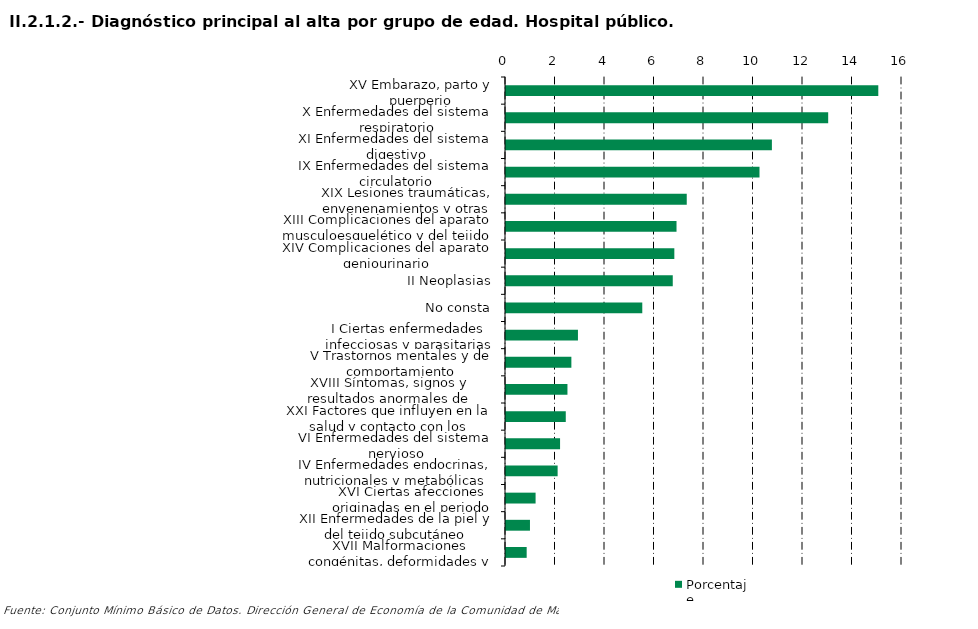
| Category | Porcentaje |
|---|---|
| XV Embarazo, parto y puerperio | 15.042 |
| X Enfermedades del sistema respiratorio | 13.018 |
| XI Enfermedades del sistema digestivo | 10.743 |
| IX Enfermedades del sistema circulatorio | 10.242 |
| XIX Lesiones traumáticas, envenenamientos y otras consecuencias de causas externas | 7.303 |
| XIII Complicaciones del aparato musculoesquelético y del tejido conectivo | 6.89 |
| XIV Complicaciones del aparato geniourinario | 6.801 |
| II Neoplasias | 6.738 |
| No consta | 5.506 |
| I Ciertas enfermedades infecciosas y parasitarias | 2.907 |
| V Trastornos mentales y de comportamiento | 2.641 |
| XVIII Síntomas, signos y resultados anormales de pruebas complementarias, no clasificados bajo otro concepto | 2.483 |
| XXI Factores que influyen en la salud y contacto con los servicios sanitarios | 2.415 |
| VI Enfermedades del sistema nervioso | 2.184 |
| IV Enfermedades endocrinas, nutricionales y metabólicas | 2.086 |
| XVI Ciertas afecciones originadas en el periodo perinatal | 1.195 |
| XII Enfermedades de la piel y del tejido subcutáneo | 0.968 |
| XVII Malformaciones congénitas, deformidades y anomalías cromosómicas | 0.835 |